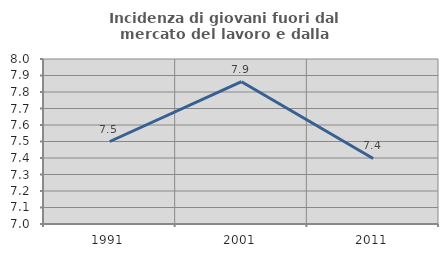
| Category | Incidenza di giovani fuori dal mercato del lavoro e dalla formazione  |
|---|---|
| 1991.0 | 7.5 |
| 2001.0 | 7.862 |
| 2011.0 | 7.397 |